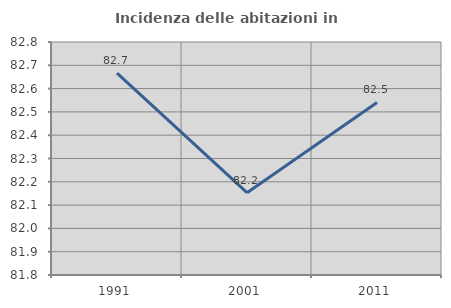
| Category | Incidenza delle abitazioni in proprietà  |
|---|---|
| 1991.0 | 82.666 |
| 2001.0 | 82.153 |
| 2011.0 | 82.541 |